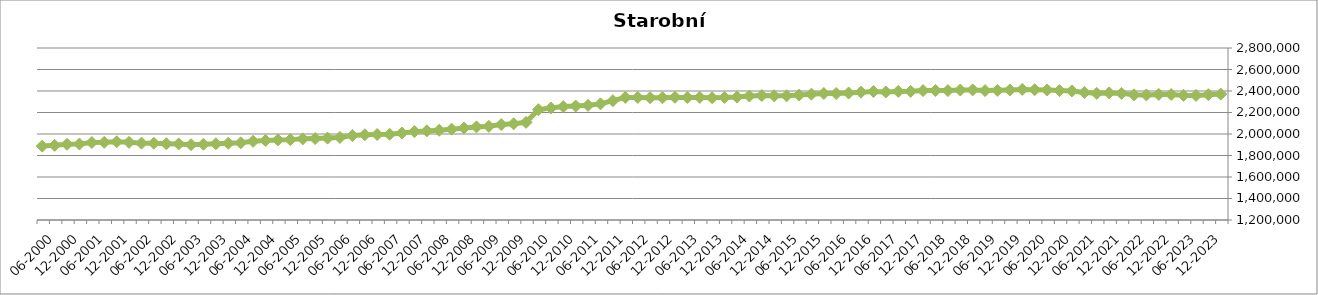
| Category | Starobní důchodci |
|---|---|
| 12-2023 | 2371241 |
| 09-2023 | 2365668 |
| 06-2023 | 2358367 |
| 03-2023 | 2359285 |
| 12-2022 | 2367185 |
| 09-2022 | 2367780 |
| 06-2022 | 2363406 |
| 03-2022 | 2364429 |
| 12-2021 | 2377820 |
| 09-2021 | 2382451 |
| 06-2021 | 2378079 |
| 03-2021 | 2385460 |
| 12-2020 | 2400479 |
| 09-2020 | 2403767 |
| 06-2020 | 2409904 |
| 03-2020 | 2412354 |
| 12-2019 | 2414814 |
| 09-2019 | 2409704 |
| 06-2019 | 2406014 |
| 03-2019 | 2403526 |
| 12-2018 | 2410080 |
| 09-2018 | 2409128 |
| 06-2018 | 2403695 |
| 03-2018 | 2404626 |
| 12-2017 | 2403933 |
| 09-2017 | 2396784 |
| 06-2017 | 2396032 |
| 03-2017 | 2390781 |
| 12-2016 | 2395382 |
| 09-2016 | 2389270 |
| 06-2016 | 2381012 |
| 03-2016 | 2376668 |
| 12-2015 | 2376883 |
| 09-2015 | 2370725 |
| 06-2015 | 2362155 |
| 03-2015 | 2355354 |
| 12-2014 | 2355144 |
| 09-2014 | 2357749 |
| 06-2014 | 2353691 |
| 03-2014 | 2343504 |
| 12-2013 | 2340321 |
| 09-2013 | 2337103 |
| 06-2013 | 2340234 |
| 03-2013 | 2340148 |
| 12-2012 | 2341220 |
| 09-2012 | 2337480 |
| 06-2012 | 2337454 |
| 03-2012 | 2340218 |
| 12-2011 | 2340147 |
| 09-2011 | 2310238 |
| 06-2011 | 2280450 |
| 03-2011 | 2266348 |
| 12-2010 | 2260032 |
| 09-2010 | 2254779 |
| 06-2010 | 2242281 |
| 03-2010 | 2225908 |
| 12-2009 | 2108368 |
| 09-2009 | 2094808 |
| 06-2009 | 2087987 |
| 03-2009 | 2071269 |
| 12-2008 | 2066005 |
| 09-2008 | 2056338 |
| 06-2008 | 2045166 |
| 03-2008 | 2034881 |
| 12-2007 | 2028865 |
| 09-2007 | 2022116 |
| 06-2007 | 2009076 |
| 03-2007 | 1997503 |
| 12-2006 | 1995350 |
| 09-2006 | 1992858 |
| 06-2006 | 1985580 |
| 03-2006 | 1967685 |
| 12-2005 | 1961870 |
| 09-2005 | 1957299 |
| 06-2005 | 1954836 |
| 03-2005 | 1947667 |
| 12-2004 | 1944915 |
| 09-2004 | 1940213 |
| 06-2004 | 1931940 |
| 03-2004 | 1917839 |
| 12-2003 | 1914219 |
| 09-2003 | 1908877 |
| 06-2003 | 1904721 |
| 03-2003 | 1900334 |
| 12-2002 | 1907830 |
| 09-2002 | 1909580 |
| 06-2002 | 1913863 |
| 03-2002 | 1914684 |
| 12-2001 | 1922772 |
| 09-2001 | 1927410 |
| 06-2001 | 1922839 |
| 03-2001 | 1920972 |
| 12-2000 | 1906759 |
| 09-2000 | 1904456 |
| 06-2000 | 1894317 |
| 03-2000 | 1887287 |